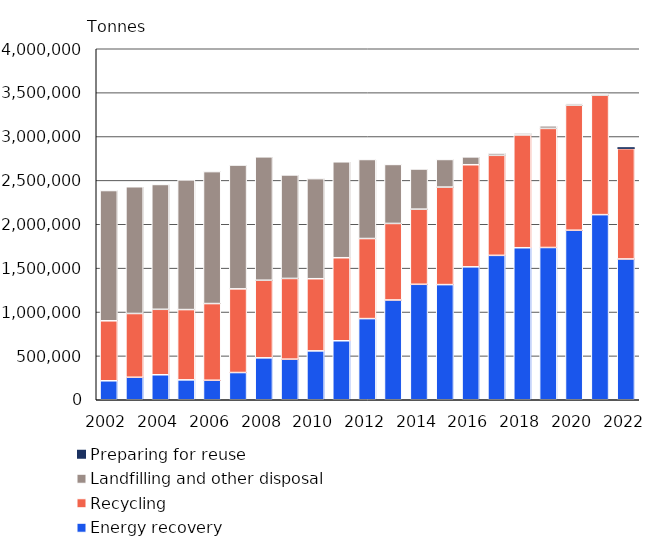
| Category | Energy recovery | Recycling | Landfilling and other disposal | Preparing for reuse |
|---|---|---|---|---|
| 2002.0 | 216314 | 683543 | 1484559 | 0 |
| 2003.0 | 256311 | 726671 | 1444541 | 0 |
| 2004.0 | 284895 | 745852 | 1422692 | 0 |
| 2005.0 | 226843 | 800784 | 1478123 | 0 |
| 2006.0 | 222323 | 873878 | 1503910 | 0 |
| 2007.0 | 310350 | 953274 | 1411294 | 0 |
| 2008.0 | 477794 | 884304 | 1406105 | 0 |
| 2009.0 | 462750 | 919830 | 1179840 | 0 |
| 2010.0 | 557131 | 822152 | 1140721 | 0 |
| 2011.0 | 672209 | 946234 | 1093277 | 0 |
| 2012.0 | 924825 | 912596 | 900674 | 0 |
| 2013.0 | 1136939 | 872210 | 672398 | 0 |
| 2014.0 | 1315820 | 856326 | 457733 | 0 |
| 2015.0 | 1312180 | 1111338 | 314762 | 0 |
| 2016.0 | 1514830 | 1163566 | 89535 | 0 |
| 2017.0 | 1645554 | 1140133 | 25902 | 0 |
| 2018.0 | 1732450 | 1285711 | 21949 | 0 |
| 2019.0 | 1735109 | 1357227 | 29669 | 0 |
| 2020.0 | 1931974 | 1424280 | 18016 | 0 |
| 2021.0 | 2109565 | 1360524 | 14499 | 0 |
| 2022.0 | 1604394 | 1257747 | 10660 | 8295 |